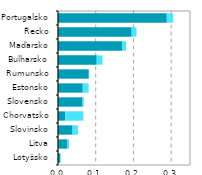
| Category |  ICT služby |  ICT zpracovatelský průmysl |
|---|---|---|
| Lotyšsko | 0.005 | 0.002 |
| Litva | 0.025 | 0.004 |
| Slovinsko | 0.039 | 0.014 |
| Chorvatsko | 0.019 | 0.048 |
| Slovensko | 0.065 | 0.003 |
| Estonsko | 0.066 | 0.016 |
| Rumunsko | 0.082 | 0.001 |
| Bulharsko | 0.103 | 0.015 |
| Maďarsko | 0.17 | 0.011 |
| Řecko | 0.195 | 0.013 |
| Portugalsko | 0.288 | 0.017 |